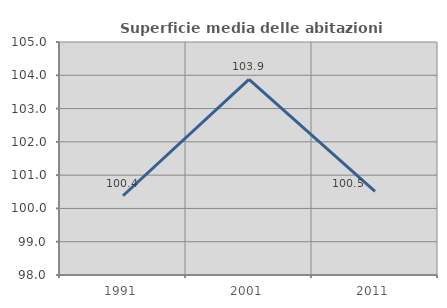
| Category | Superficie media delle abitazioni occupate |
|---|---|
| 1991.0 | 100.382 |
| 2001.0 | 103.88 |
| 2011.0 | 100.515 |